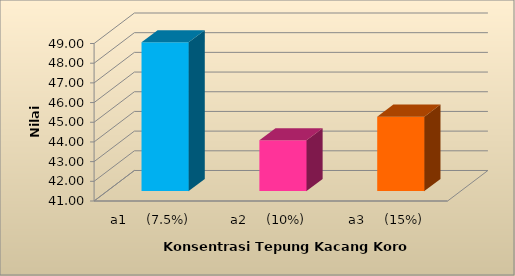
| Category | Rata-rata |
|---|---|
| a1     (7.5%) | 48.556 |
| a2     (10%) | 43.578 |
| a3     (15%) | 44.778 |